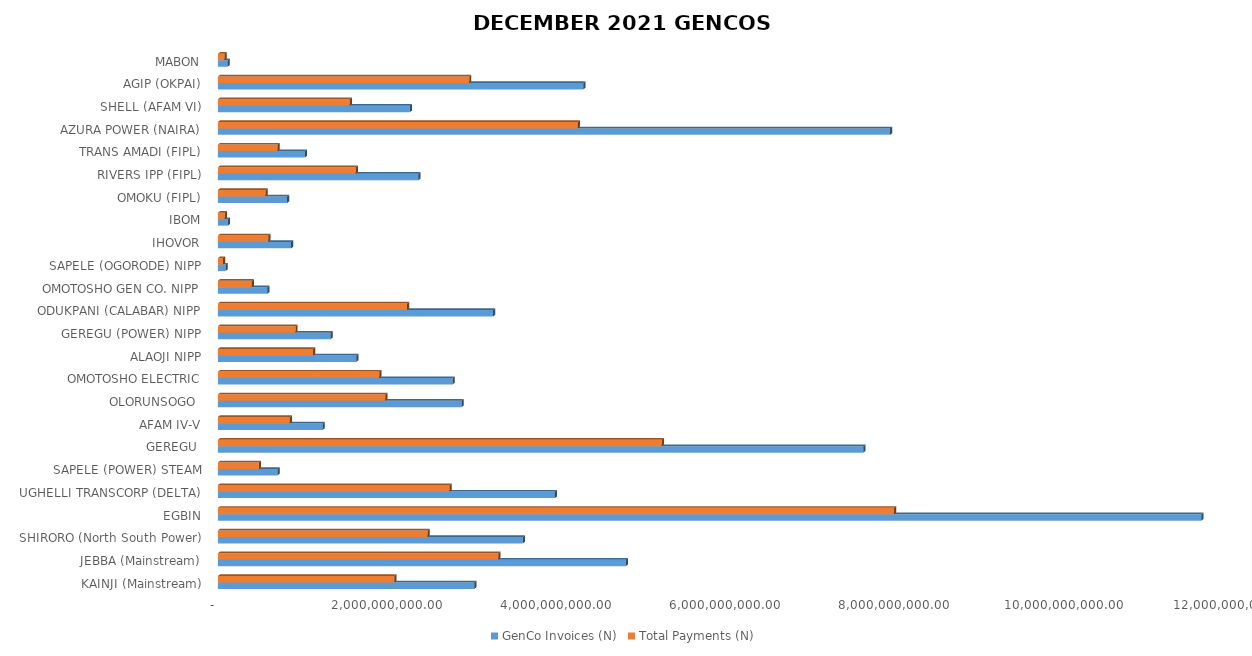
| Category | GenCo Invoices (N) | Total Payments (N) |
|---|---|---|
| KAINJI (Mainstream) | 3031363235.37 | 2084583077.849 |
| JEBBA (Mainstream) | 4821053457.16 | 3315302612.679 |
| SHIRORO (North South Power) | 3603342705.38 | 2477917241.88 |
| EGBIN | 11623721397.43 | 7993305666.57 |
| UGHELLI TRANSCORP (DELTA) | 3983290584.04 | 2739196691.693 |
| SAPELE (POWER) STEAM | 704847197.77 | 484703556.405 |
| GEREGU  | 7628153102.08 | 5245665938.776 |
| AFAM IV-V | 1236628399.45 | 850394504.031 |
| OLORUNSOGO  | 2878687717.07 | 1979592426.073 |
| OMOTOSHO ELECTRIC | 2772297218.92 | 1906430678.415 |
| ALAOJI NIPP | 1635913998.11 | 1124971958.981 |
| GEREGU (POWER) NIPP | 1332170193.55 | 916095903.614 |
| ODUKPANI (CALABAR) NIPP | 3252403131.49 | 2236585985.849 |
| OMOTOSHO GEN CO. NIPP | 584106972.48 | 401673905.746 |
| SAPELE (OGORODE) NIPP | 88870951.4 | 61114049.032 |
| IHOVOR | 865421335.47 | 595125866.172 |
| IBOM | 116679144.22 | 80236959.643 |
| OMOKU (FIPL) | 817896894.01 | 562444646.945 |
| RIVERS IPP (FIPL) | 2369385405.78 | 1629359577.949 |
| TRANS AMADI (FIPL) | 1026645985.52 | 705995514.95 |
| AZURA POWER (NAIRA) | 7945020033.546 | 4254728627.014 |
| SHELL (AFAM VI) | 2267002001.316 | 1558953395.704 |
| AGIP (OKPAI) | 4318696929.52 | 2969846184.249 |
| MABON | 113751162.36 | 78223469.024 |